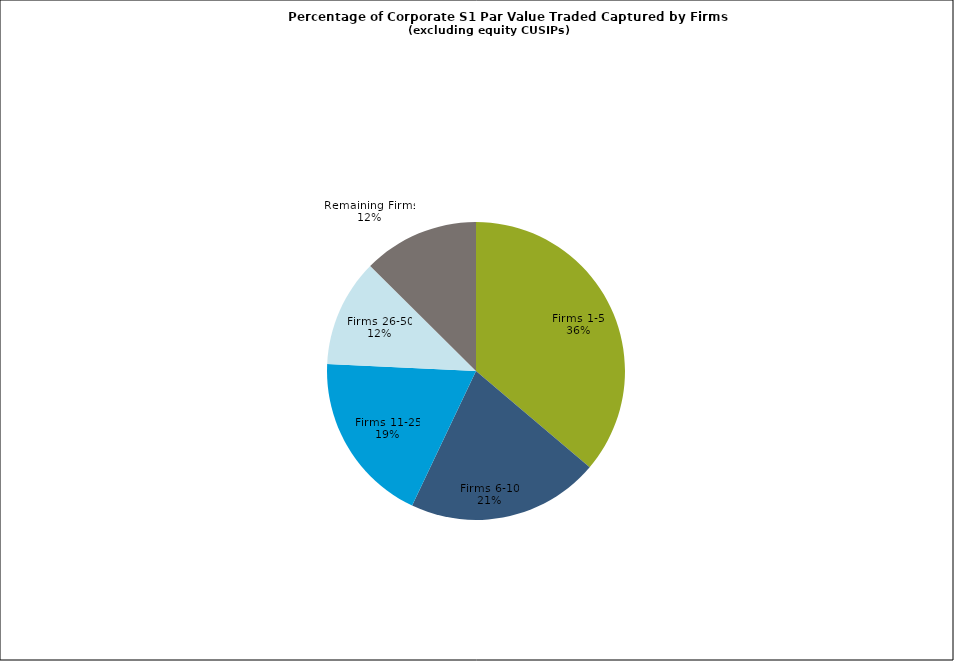
| Category | Series 0 |
|---|---|
| Firms 1-5 | 0.362 |
| Firms 6-10 | 0.209 |
| Firms 11-25 | 0.187 |
| Firms 26-50 | 0.117 |
| Remaining Firms | 0.126 |